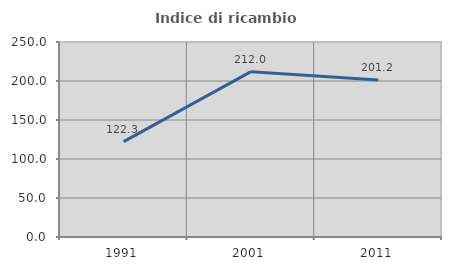
| Category | Indice di ricambio occupazionale  |
|---|---|
| 1991.0 | 122.337 |
| 2001.0 | 211.957 |
| 2011.0 | 201.23 |